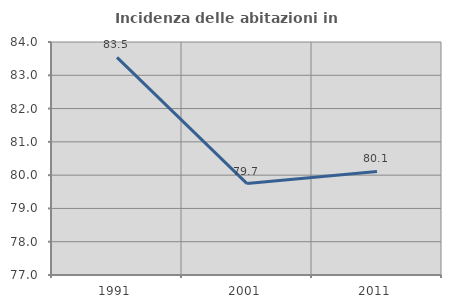
| Category | Incidenza delle abitazioni in proprietà  |
|---|---|
| 1991.0 | 83.537 |
| 2001.0 | 79.747 |
| 2011.0 | 80.11 |